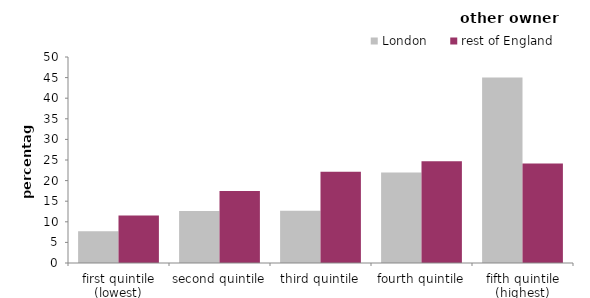
| Category | London | rest of England |
|---|---|---|
| first quintile (lowest) | 7.715 | 11.558 |
| second quintile | 12.636 | 17.458 |
| third quintile | 12.659 | 22.145 |
| fourth quintile | 21.965 | 24.71 |
| fifth quintile (highest) | 45.025 | 24.128 |